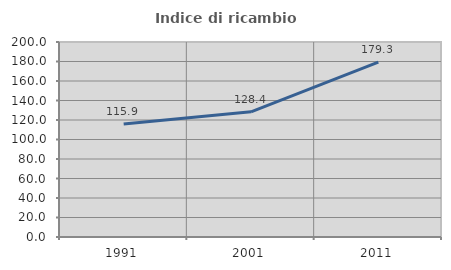
| Category | Indice di ricambio occupazionale  |
|---|---|
| 1991.0 | 115.888 |
| 2001.0 | 128.358 |
| 2011.0 | 179.259 |